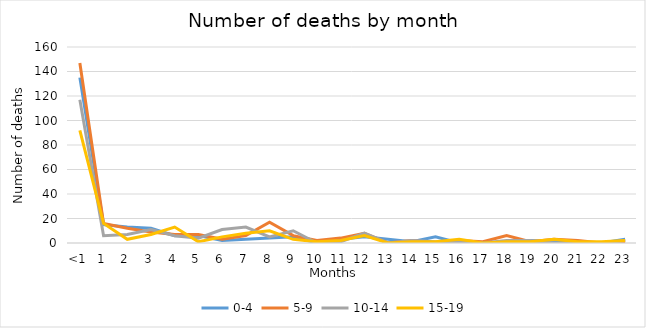
| Category | 0-4 | 5-9 | 10-14 | 15-19 |
|---|---|---|---|---|
| <1 | 135 | 147 | 117 | 92 |
| 1 | 15 | 16 | 6 | 16 |
| 2 | 13 | 12 | 7 | 3 |
| 3 | 12 | 9 | 11 | 7 |
| 4 | 6 | 7 | 6 | 13 |
| 5 | 6 | 7 | 4 | 1 |
| 6 | 2 | 3 | 11 | 5 |
| 7 | 3 | 6 | 13 | 8 |
| 8 | 4 | 17 | 5 | 10 |
| 9 | 5 | 6 | 10 | 3 |
| 10 | 0 | 2 | 0 | 1 |
| 11 | 3 | 4 | 1 | 2 |
| 12 | 5 | 8 | 8 | 6 |
| 13 | 3 | 0 | 0 | 0 |
| 14 | 1 | 2 | 2 | 1 |
| 15 | 5 | 0 | 1 | 1 |
| 16 | 0 | 2 | 1 | 3 |
| 17 | 0 | 1 | 0 | 0 |
| 18 | 0 | 6 | 2 | 1 |
| 19 | 2 | 1 | 2 | 1 |
| 20 | 1 | 3 | 0 | 3 |
| 21 | 0 | 2 | 0 | 1 |
| 22 | 0 | 0 | 0 | 1 |
| 23 | 3 | 1 | 2 | 2 |